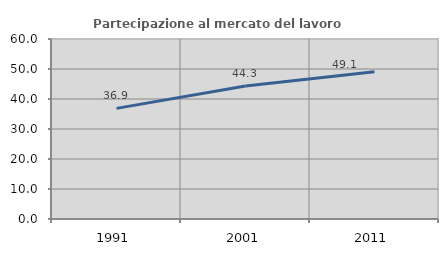
| Category | Partecipazione al mercato del lavoro  femminile |
|---|---|
| 1991.0 | 36.868 |
| 2001.0 | 44.308 |
| 2011.0 | 49.11 |